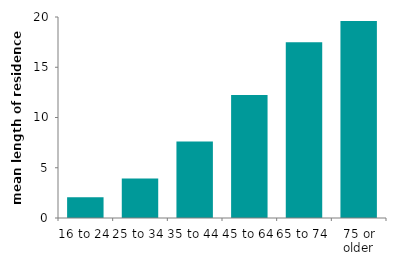
| Category | Series 0 |
|---|---|
| 16 to 24 | 2.053 |
| 25 to 34 | 3.92 |
| 35 to 44 | 7.616 |
| 45 to 64 | 12.25 |
| 65 to 74 | 17.491 |
| 75 or older | 19.59 |